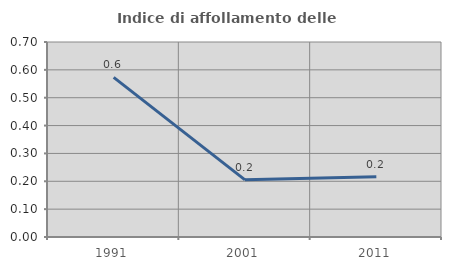
| Category | Indice di affollamento delle abitazioni  |
|---|---|
| 1991.0 | 0.573 |
| 2001.0 | 0.205 |
| 2011.0 | 0.216 |